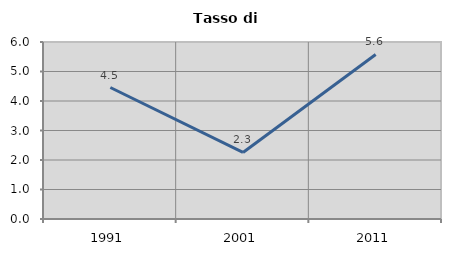
| Category | Tasso di disoccupazione   |
|---|---|
| 1991.0 | 4.458 |
| 2001.0 | 2.256 |
| 2011.0 | 5.577 |